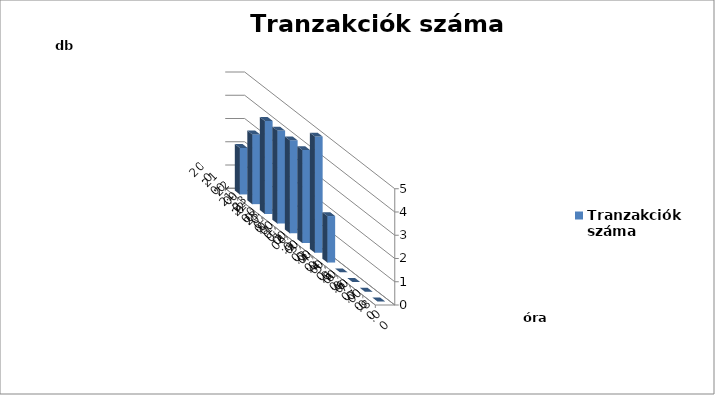
| Category | Tranzakciók száma |
|---|---|
| 20:00-21:00 | 2 |
| 21:00-22:00 | 3 |
| 22:00-23:00 | 4 |
| 23:00-0:00 | 4 |
| 0:00-1:00 | 4 |
| 1:00-2:00 | 4 |
| 2:00-3:00 | 5 |
| 3:00-4:00 | 2 |
| 4:00-5:00 | 0 |
| 5:00-6:00 | 0 |
| 6:00-7:00 | 0 |
| 7:00-8:00 | 0 |